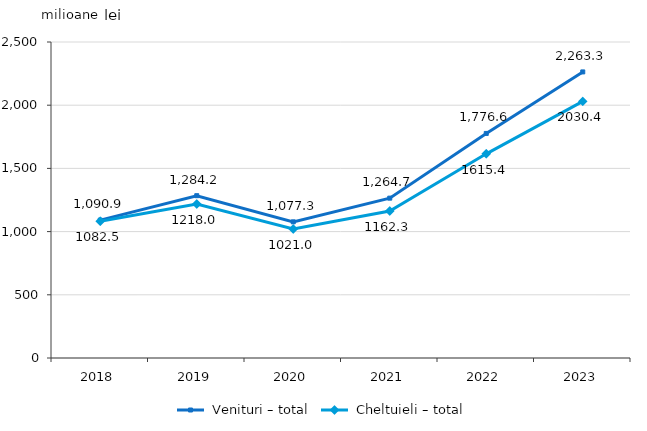
| Category | Series 0 | Series 1 |
|---|---|---|
| 2018.0 | 1090.922 | 1082.455 |
| 2019.0 | 1284.167 | 1217.991 |
| 2020.0 | 1077.251 | 1020.951 |
| 2021.0 | 1264.668 | 1162.337 |
| 2022.0 | 1776.616 | 1615.429 |
| 2023.0 | 2263.328 | 2030.413 |